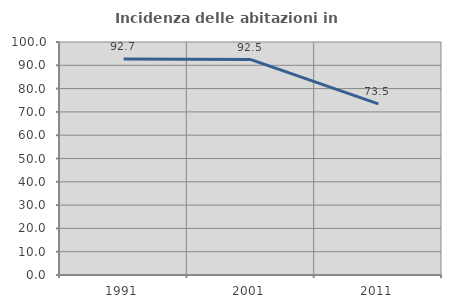
| Category | Incidenza delle abitazioni in proprietà  |
|---|---|
| 1991.0 | 92.708 |
| 2001.0 | 92.453 |
| 2011.0 | 73.469 |